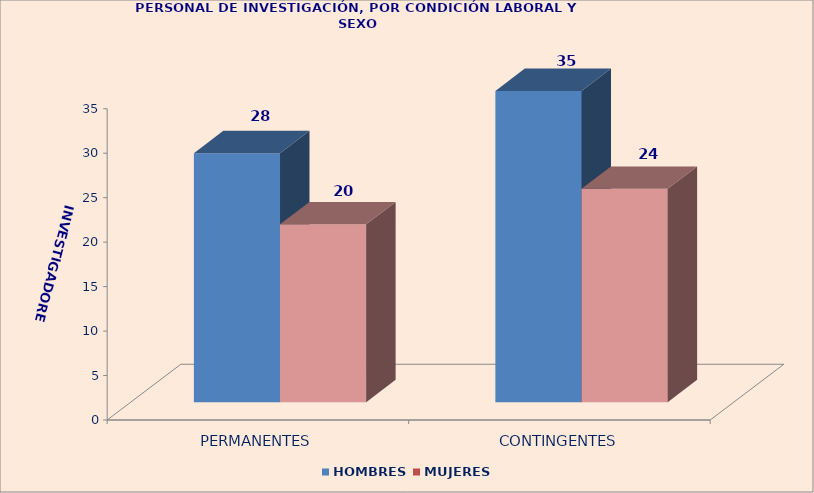
| Category | HOMBRES | MUJERES |
|---|---|---|
| PERMANENTES | 28 | 20 |
| CONTINGENTES | 35 | 24 |